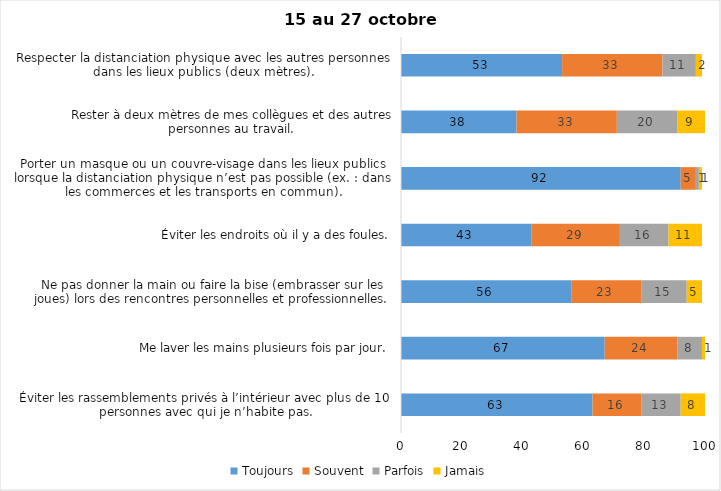
| Category | Toujours | Souvent | Parfois | Jamais |
|---|---|---|---|---|
| Éviter les rassemblements privés à l’intérieur avec plus de 10 personnes avec qui je n’habite pas. | 63 | 16 | 13 | 8 |
| Me laver les mains plusieurs fois par jour. | 67 | 24 | 8 | 1 |
| Ne pas donner la main ou faire la bise (embrasser sur les joues) lors des rencontres personnelles et professionnelles. | 56 | 23 | 15 | 5 |
| Éviter les endroits où il y a des foules. | 43 | 29 | 16 | 11 |
| Porter un masque ou un couvre-visage dans les lieux publics lorsque la distanciation physique n’est pas possible (ex. : dans les commerces et les transports en commun). | 92 | 5 | 1 | 1 |
| Rester à deux mètres de mes collègues et des autres personnes au travail. | 38 | 33 | 20 | 9 |
| Respecter la distanciation physique avec les autres personnes dans les lieux publics (deux mètres). | 53 | 33 | 11 | 2 |